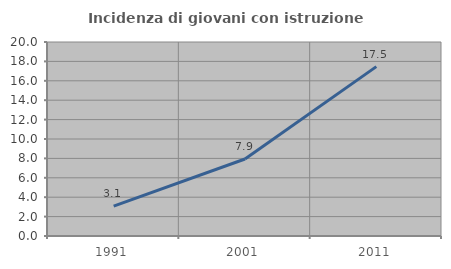
| Category | Incidenza di giovani con istruzione universitaria |
|---|---|
| 1991.0 | 3.081 |
| 2001.0 | 7.937 |
| 2011.0 | 17.46 |